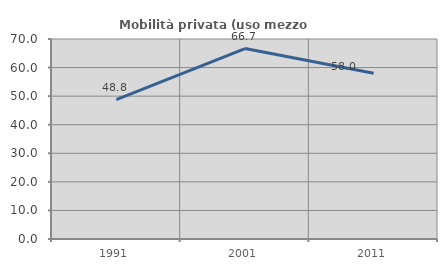
| Category | Mobilità privata (uso mezzo privato) |
|---|---|
| 1991.0 | 48.78 |
| 2001.0 | 66.667 |
| 2011.0 | 58 |